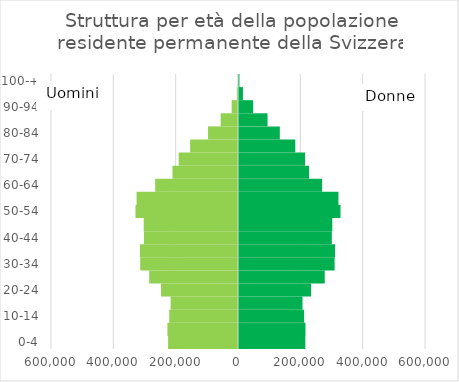
| Category | Uomini | Donne |
|---|---|---|
| 0-4 | -224268 | 212850 |
| 5-9 | -226409 | 213276 |
| 10-14 | -220562 | 208906 |
| 15-19 | -216228 | 203802 |
| 20-24 | -247027 | 231154 |
| 25-29 | -284900 | 275053 |
| 30-34 | -313683 | 306776 |
| 35-39 | -314591 | 308180 |
| 40-44 | -301811 | 297807 |
| 45-49 | -302514 | 299345 |
| 50-54 | -328949 | 325660 |
| 55-59 | -325419 | 319081 |
| 60-64 | -265775 | 266604 |
| 65-69 | -210196 | 224718 |
| 70-74 | -190316 | 211899 |
| 75-79 | -153639 | 180613 |
| 80-84 | -96134 | 130952 |
| 85-89 | -55660 | 91514 |
| 90-94 | -20336 | 45440 |
| 95-99 | -3874 | 12653 |
| 100-+ | -308 | 1418 |